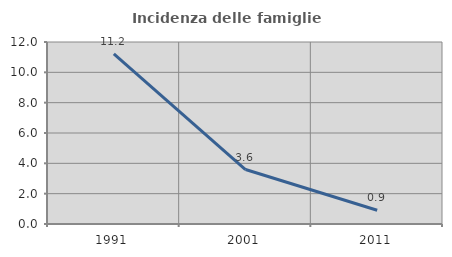
| Category | Incidenza delle famiglie numerose |
|---|---|
| 1991.0 | 11.22 |
| 2001.0 | 3.59 |
| 2011.0 | 0.906 |